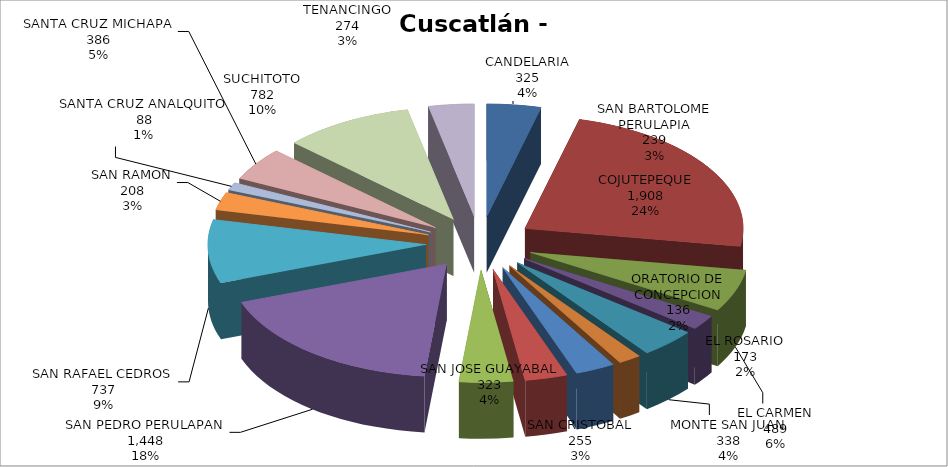
| Category | Series 0 |
|---|---|
| CANDELARIA | 325 |
| COJUTEPEQUE | 1908 |
| EL CARMEN | 489 |
| EL ROSARIO | 173 |
| MONTE SAN JUAN | 338 |
| ORATORIO DE CONCEPCION | 136 |
| SAN BARTOLOME PERULAPIA | 239 |
| SAN CRISTOBAL | 255 |
| SAN JOSE GUAYABAL | 323 |
| SAN PEDRO PERULAPAN | 1448 |
| SAN RAFAEL CEDROS | 737 |
| SAN RAMON | 208 |
| SANTA CRUZ ANALQUITO | 88 |
| SANTA CRUZ MICHAPA | 386 |
| SUCHITOTO | 782 |
| TENANCINGO | 274 |